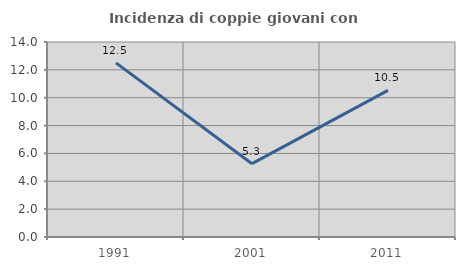
| Category | Incidenza di coppie giovani con figli |
|---|---|
| 1991.0 | 12.5 |
| 2001.0 | 5.263 |
| 2011.0 | 10.526 |